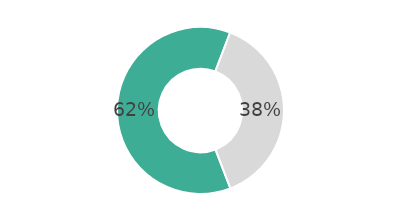
| Category | Series 0 |
|---|---|
| 0 | 61.621 |
| 1 | 38.379 |